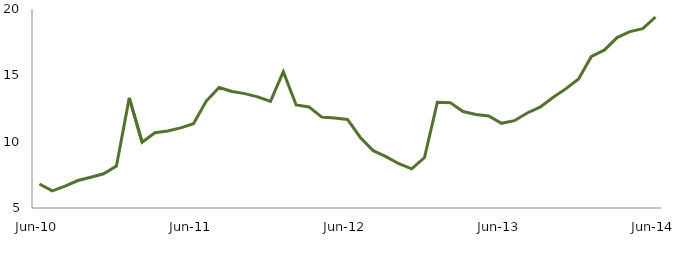
| Category | Series 0 |
|---|---|
| Jun-10 | 6.813 |
|  | 6.294 |
|  | 6.648 |
|  | 7.07 |
|  | 7.319 |
|  | 7.58 |
|  | 8.163 |
|  | 13.299 |
|  | 9.962 |
|  | 10.668 |
|  | 10.801 |
|  | 11.043 |
| Jun-11 | 11.347 |
|  | 13.063 |
|  | 14.083 |
|  | 13.787 |
|  | 13.621 |
|  | 13.374 |
|  | 13.036 |
|  | 15.271 |
|  | 12.765 |
|  | 12.617 |
|  | 11.855 |
|  | 11.781 |
| Jun-12 | 11.679 |
|  | 10.318 |
|  | 9.321 |
|  | 8.873 |
|  | 8.337 |
|  | 7.949 |
|  | 8.805 |
|  | 12.972 |
|  | 12.942 |
|  | 12.269 |
|  | 12.044 |
|  | 11.937 |
| Jun-13 | 11.385 |
|  | 11.582 |
|  | 12.163 |
|  | 12.602 |
|  | 13.328 |
|  | 13.977 |
|  | 14.732 |
|  | 16.419 |
|  | 16.896 |
|  | 17.846 |
|  | 18.295 |
|  | 18.518 |
| Jun-14 | 19.397 |